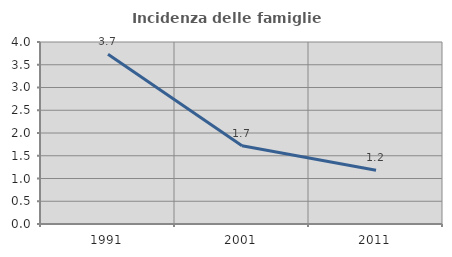
| Category | Incidenza delle famiglie numerose |
|---|---|
| 1991.0 | 3.733 |
| 2001.0 | 1.718 |
| 2011.0 | 1.179 |